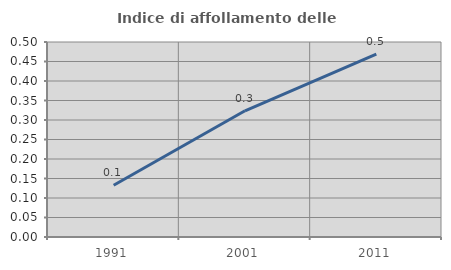
| Category | Indice di affollamento delle abitazioni  |
|---|---|
| 1991.0 | 0.133 |
| 2001.0 | 0.324 |
| 2011.0 | 0.469 |